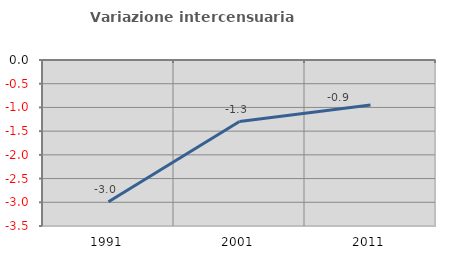
| Category | Variazione intercensuaria annua |
|---|---|
| 1991.0 | -2.988 |
| 2001.0 | -1.298 |
| 2011.0 | -0.949 |